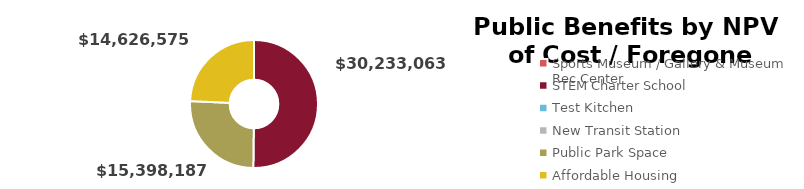
| Category | Series 0 |
|---|---|
| Sports Museum / Gallery & Museum Rec Center | 0 |
| STEM Charter School | 30233063.215 |
| Test Kitchen | 0 |
| New Transit Station | 0 |
| Public Park Space | 15398186.713 |
| Affordable Housing | 14626574.89 |